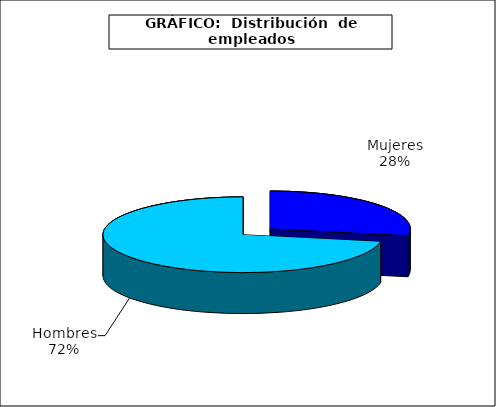
| Category | persona |
|---|---|
| 0 | 4225.418 |
| 1 | 10908.14 |